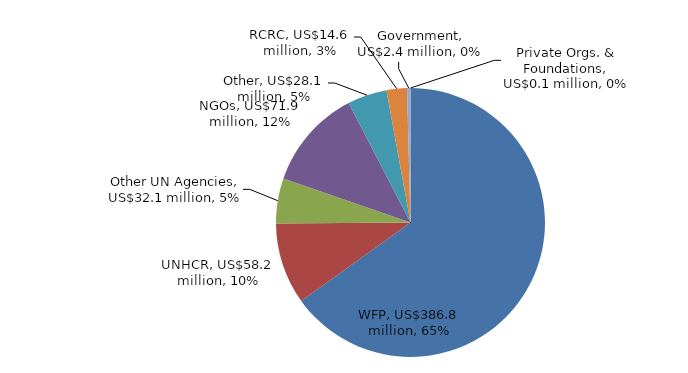
| Category | Series 0 |
|---|---|
| WFP | 386.8 |
| UNHCR | 58.171 |
| Other UN Agencies | 32.143 |
| NGOs | 71.893 |
| Other | 28.141 |
| RCRC | 14.598 |
| Government | 2.355 |
| Private Orgs. & Foundations | 0.087 |